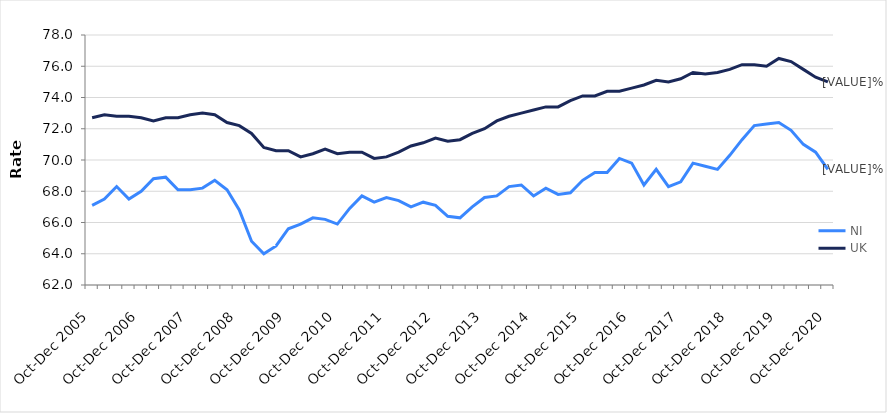
| Category | NI | UK |
|---|---|---|
| Oct-Dec 2005 | 67.1 | 72.7 |
| Jan-Mar 2006 | 67.5 | 72.9 |
| Apr-Jun 2006 | 68.3 | 72.8 |
| Jul-Sep 2006 | 67.5 | 72.8 |
| Oct-Dec 2006 | 68 | 72.7 |
| Jan-Mar 2007 | 68.8 | 72.5 |
| Apr-Jun 2007 | 68.9 | 72.7 |
| Jul-Sep 2007 | 68.1 | 72.7 |
| Oct-Dec 2007 | 68.1 | 72.9 |
| Jan-Mar 2008 | 68.2 | 73 |
| Apr-Jun 2008 | 68.7 | 72.9 |
| Jul-Sep 2008 | 68.1 | 72.4 |
| Oct-Dec 2008 | 66.8 | 72.2 |
| Jan-Mar 2009 | 64.8 | 71.7 |
| Apr-Jun 2009 | 64 | 70.8 |
| Jul-Sep 2009 | 64.5 | 70.6 |
| Oct-Dec 2009 | 65.6 | 70.6 |
| Jan-Mar 2010 | 65.9 | 70.2 |
| Apr-Jun 2010 | 66.3 | 70.4 |
| Jul-Sep 2010 | 66.2 | 70.7 |
| Oct-Dec 2010 | 65.9 | 70.4 |
| Jan-Mar 2011 | 66.9 | 70.5 |
| Apr-Jun 2011 | 67.7 | 70.5 |
| Jul-Sep 2011 | 67.3 | 70.1 |
| Oct-Dec 2011 | 67.6 | 70.2 |
| Jan-Mar 2012 | 67.4 | 70.5 |
| Apr-Jun 2012 | 67 | 70.9 |
| Jul-Sep 2012 | 67.3 | 71.1 |
| Oct-Dec 2012 | 67.1 | 71.4 |
| Jan-Mar 2013 | 66.4 | 71.2 |
| Apr-Jun 2013 | 66.3 | 71.3 |
| Jul-Sep 2013 | 67 | 71.7 |
| Oct-Dec 2013 | 67.6 | 72 |
| Jan-Mar 2014 | 67.7 | 72.5 |
| Apr-Jun 2014 | 68.3 | 72.8 |
| Jul-Sep 2014 | 68.4 | 73 |
| Oct-Dec 2014 | 67.7 | 73.2 |
| Jan-Mar 2015 | 68.2 | 73.4 |
| Apr-Jun 2015 | 67.8 | 73.4 |
| Jul-Sep 2015 | 67.9 | 73.8 |
| Oct-Dec 2015 | 68.7 | 74.1 |
| Jan-Mar 2016 | 69.2 | 74.1 |
| Apr-Jun 2016 | 69.2 | 74.4 |
| Jul-Sep 2016 | 70.1 | 74.4 |
| Oct-Dec 2016 | 69.8 | 74.6 |
| Jan-Mar 2017 | 68.4 | 74.8 |
| Apr-Jun 2017 | 69.4 | 75.1 |
| Jul-Sep 2017 | 68.3 | 75 |
| Oct-Dec 2017 | 68.6 | 75.2 |
| Jan-Mar 2018 | 69.8 | 75.6 |
| Apr-Jun 2018 | 69.6 | 75.5 |
| Jul-Sep 2018 | 69.4 | 75.6 |
| Oct-Dec 2018 | 70.3 | 75.8 |
| Jan-Mar 2019 | 71.3 | 76.1 |
| Apr-Jun 2019 | 72.2 | 76.1 |
| Jul-Sep 2019 | 72.3 | 76 |
| Oct-Dec 2019 | 72.4 | 76.5 |
| Jan-Mar 2020 | 71.9 | 76.3 |
| Apr-Jun 2020 | 71 | 75.8 |
| Jul-Sep 2020 | 70.5 | 75.3 |
| Oct-Dec 2020 | 69.4 | 75 |